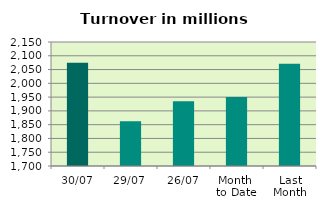
| Category | Series 0 |
|---|---|
| 30/07 | 2074.787 |
| 29/07 | 1861.958 |
| 26/07 | 1934.644 |
| Month 
to Date | 1949.95 |
| Last
Month | 2071.376 |